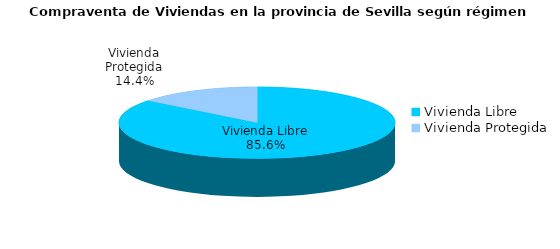
| Category | Series 0 | Series 1 |
|---|---|---|
| Vivienda Libre | 725 | 0.856 |
| Vivienda Protegida | 122 | 0.144 |